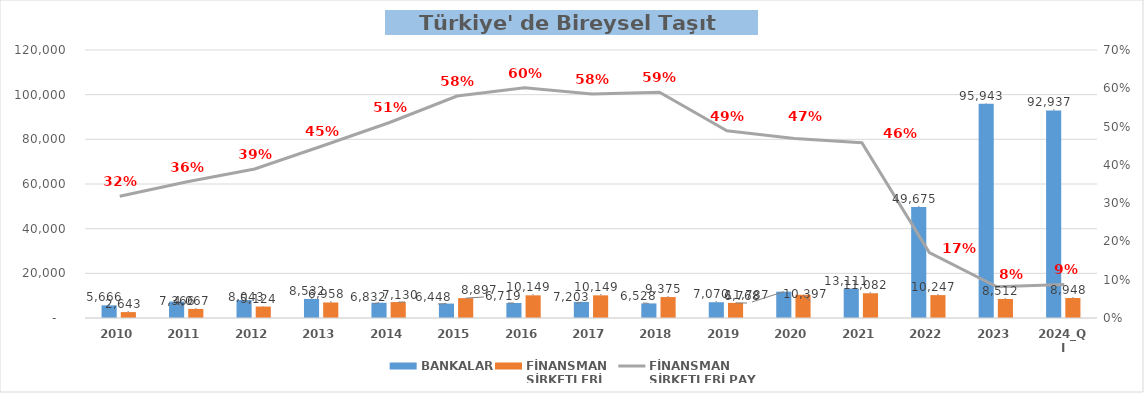
| Category | BANKALAR | FİNANSMAN 
ŞİRKETLERİ |
|---|---|---|
| 2010 | 5665.615 | 2643.169 |
| 2011 | 7366.42 | 4066.867 |
| 2012 | 8042.797 | 5124.261 |
| 2013 | 8531.566 | 6958.23 |
| 2014 | 6832.186 | 7129.957 |
| 2015 | 6447.808 | 8897.137 |
| 2016 | 6719.498 | 10148.982 |
| 2017 | 7202.608 | 10148.903 |
| 2018 | 6528.18 | 9375.099 |
| 2019 | 7070.3 | 6767.535 |
| 2020 | 11786.807 | 10397.228 |
| 2021 | 13111.088 | 11081.747 |
| 2022 | 49674.663 | 10247.463 |
| 2023 | 95943.138 | 8512.197 |
| 2024_QI | 92937.352 | 8947.763 |